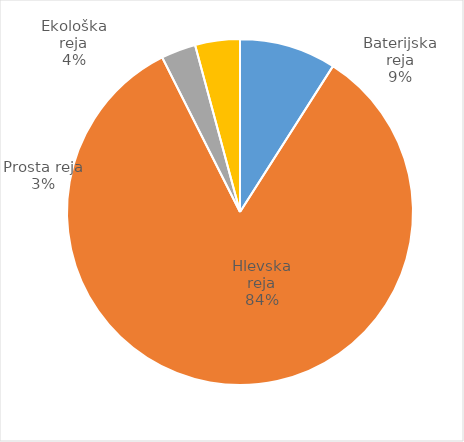
| Category | Število kosov jajc |
|---|---|
| Baterijska reja | 302024 |
| Hlevska reja | 2794014 |
| Prosta reja | 108350 |
| Ekološka reja | 139860 |